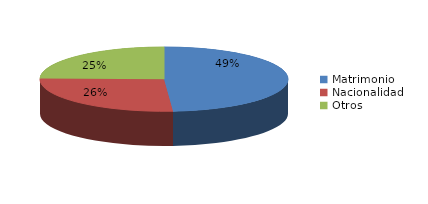
| Category | Series 0 |
|---|---|
| Matrimonio | 847 |
| Nacionalidad | 459 |
| Otros | 428 |